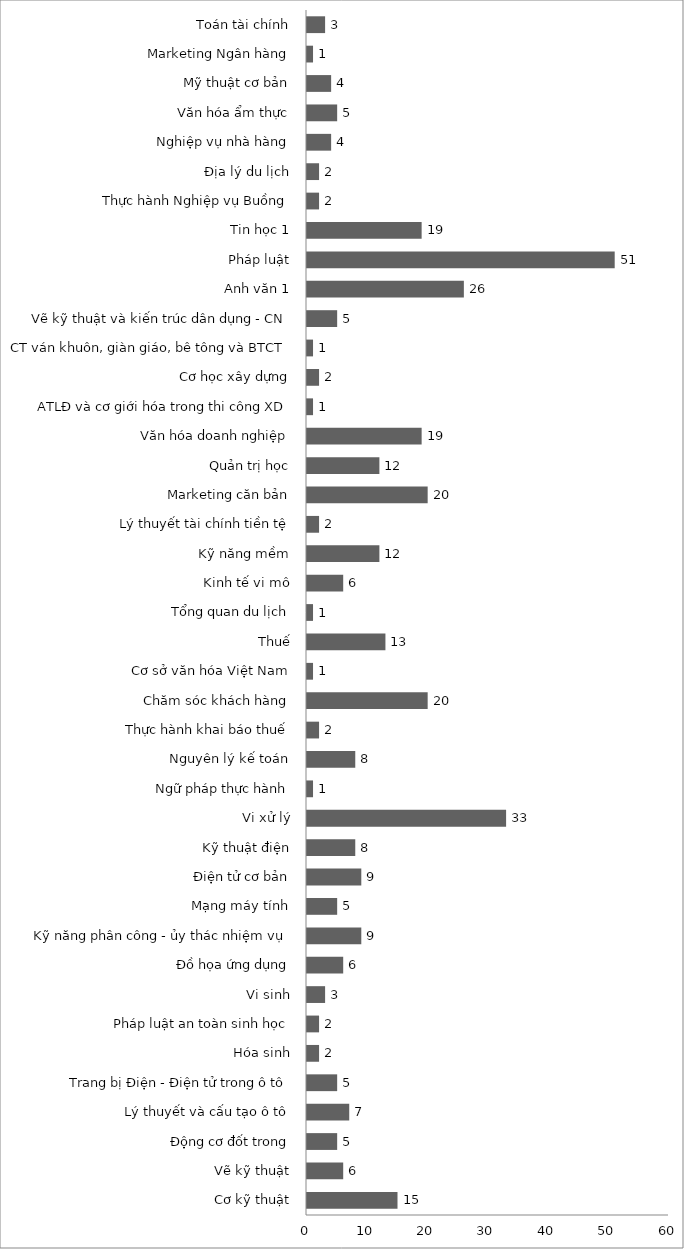
| Category | Series 0 |
|---|---|
| Cơ kỹ thuật | 15 |
| Vẽ kỹ thuật | 6 |
| Động cơ đốt trong | 5 |
| Lý thuyết và cấu tạo ô tô | 7 |
| Trang bị Điện - Điện tử trong ô tô | 5 |
| Hóa sinh | 2 |
| Pháp luật an toàn sinh học | 2 |
| Vi sinh | 3 |
| Đồ họa ứng dụng | 6 |
| Kỹ năng phân công - ủy thác nhiệm vụ | 9 |
| Mạng máy tính | 5 |
| Điện tử cơ bản | 9 |
| Kỹ thuật điện | 8 |
| Vi xử lý | 33 |
| Ngữ pháp thực hành | 1 |
| Nguyên lý kế toán | 8 |
| Thực hành khai báo thuế | 2 |
| Chăm sóc khách hàng | 20 |
| Cơ sở văn hóa Việt Nam | 1 |
| Thuế | 13 |
| Tổng quan du lịch | 1 |
| Kinh tế vi mô | 6 |
| Kỹ năng mềm | 12 |
| Lý thuyết tài chính tiền tệ | 2 |
| Marketing căn bản | 20 |
| Quản trị học | 12 |
| Văn hóa doanh nghiệp | 19 |
| ATLĐ và cơ giới hóa trong thi công XD | 1 |
| Cơ học xây dựng | 2 |
| CT ván khuôn, giàn giáo, bê tông và BTCT | 1 |
| Vẽ kỹ thuật và kiến trúc dân dụng - CN | 5 |
| Anh văn 1 | 26 |
| Pháp luật | 51 |
| Tin học 1 | 19 |
| Thực hành Nghiệp vụ Buồng | 2 |
| Địa lý du lịch | 2 |
| Nghiệp vụ nhà hàng | 4 |
| Văn hóa ẩm thực | 5 |
| Mỹ thuật cơ bản | 4 |
| Marketing Ngân hàng | 1 |
| Toán tài chính | 3 |